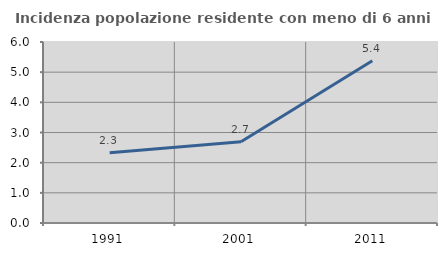
| Category | Incidenza popolazione residente con meno di 6 anni |
|---|---|
| 1991.0 | 2.332 |
| 2001.0 | 2.694 |
| 2011.0 | 5.376 |